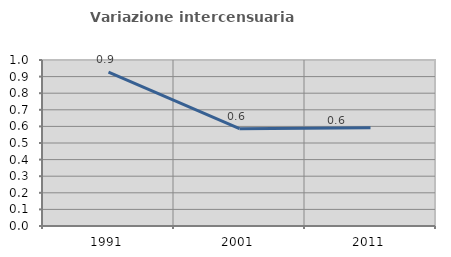
| Category | Variazione intercensuaria annua |
|---|---|
| 1991.0 | 0.927 |
| 2001.0 | 0.586 |
| 2011.0 | 0.591 |